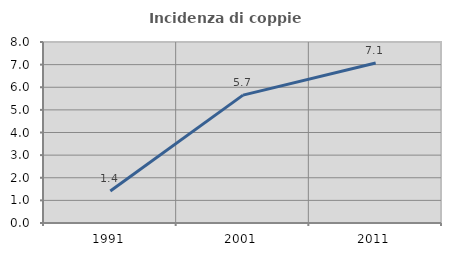
| Category | Incidenza di coppie miste |
|---|---|
| 1991.0 | 1.417 |
| 2001.0 | 5.653 |
| 2011.0 | 7.069 |